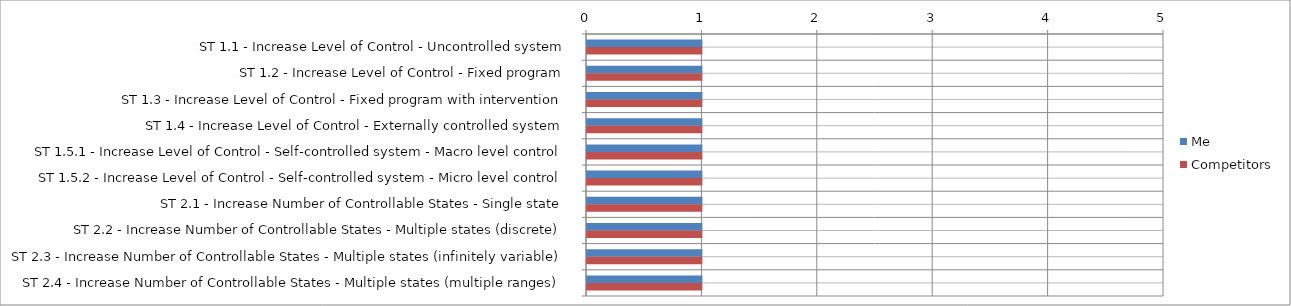
| Category | Me | Competitors |
|---|---|---|
| ST 1.1 - Increase Level of Control - Uncontrolled system | 1 | 1 |
| ST 1.2 - Increase Level of Control - Fixed program | 1 | 1 |
| ST 1.3 - Increase Level of Control - Fixed program with intervention | 1 | 1 |
| ST 1.4 - Increase Level of Control - Externally controlled system | 1 | 1 |
| ST 1.5.1 - Increase Level of Control - Self-controlled system - Macro level control | 1 | 1 |
| ST 1.5.2 - Increase Level of Control - Self-controlled system - Micro level control | 1 | 1 |
| ST 2.1 - Increase Number of Controllable States - Single state | 1 | 1 |
| ST 2.2 - Increase Number of Controllable States - Multiple states (discrete) | 1 | 1 |
| ST 2.3 - Increase Number of Controllable States - Multiple states (infinitely variable) | 1 | 1 |
| ST 2.4 - Increase Number of Controllable States - Multiple states (multiple ranges) | 1 | 1 |